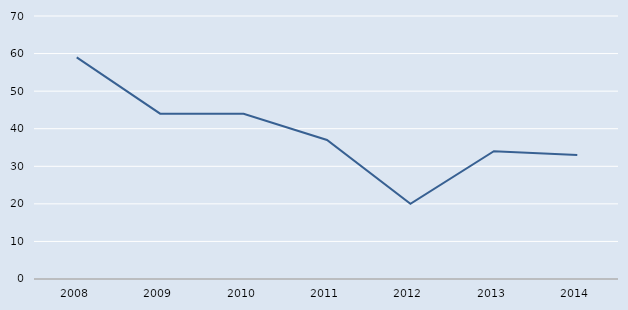
| Category | Series 0 |
|---|---|
| 2008.0 | 59 |
| 2009.0 | 44 |
| 2010.0 | 44 |
| 2011.0 | 37 |
| 2012.0 | 20 |
| 2013.0 | 34 |
| 2014.0 | 33 |